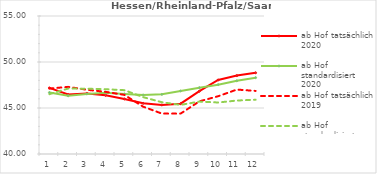
| Category | ab Hof tatsächlich 2020 | ab Hof standardisiert 2020 | ab Hof tatsächlich 2019 | ab Hof standardisiert 2019 |
|---|---|---|---|---|
| 0 | 47.182 | 46.68 | 47.107 | 46.504 |
| 1 | 46.465 | 46.325 | 47.298 | 47.114 |
| 2 | 46.584 | 46.529 | 46.982 | 47.096 |
| 3 | 46.377 | 46.647 | 46.756 | 47.039 |
| 4 | 45.983 | 46.529 | 46.426 | 46.938 |
| 5 | 45.51 | 46.417 | 45.145 | 46.182 |
| 6 | 45.333 | 46.483 | 44.393 | 45.627 |
| 7 | 45.467 | 46.854 | 44.394 | 45.341 |
| 8 | 46.826 | 47.208 | 45.726 | 45.697 |
| 9 | 48.043 | 47.539 | 46.278 | 45.599 |
| 10 | 48.521 | 47.956 | 47.003 | 45.81 |
| 11 | 48.826 | 48.296 | 46.857 | 45.903 |